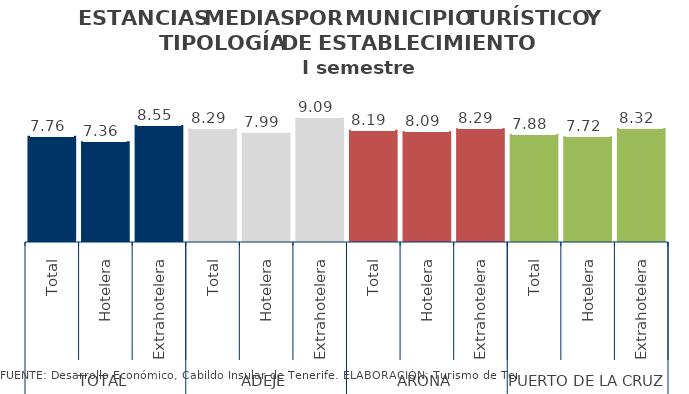
| Category | Series 2 |
|---|---|
| 0 | 7.763 |
| 1 | 7.362 |
| 2 | 8.549 |
| 3 | 8.294 |
| 4 | 7.994 |
| 5 | 9.095 |
| 6 | 8.192 |
| 7 | 8.091 |
| 8 | 8.295 |
| 9 | 7.881 |
| 10 | 7.724 |
| 11 | 8.325 |